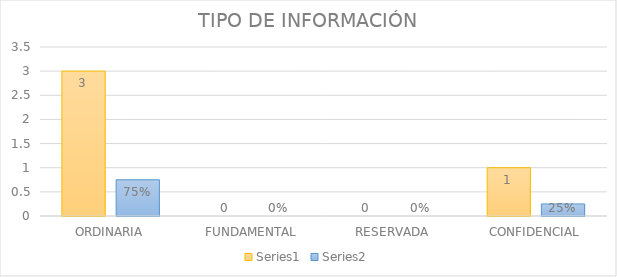
| Category | Series 3 | Series 4 |
|---|---|---|
| ORDINARIA | 3 | 0.75 |
| FUNDAMENTAL | 0 | 0 |
| RESERVADA | 0 | 0 |
| CONFIDENCIAL | 1 | 0.25 |